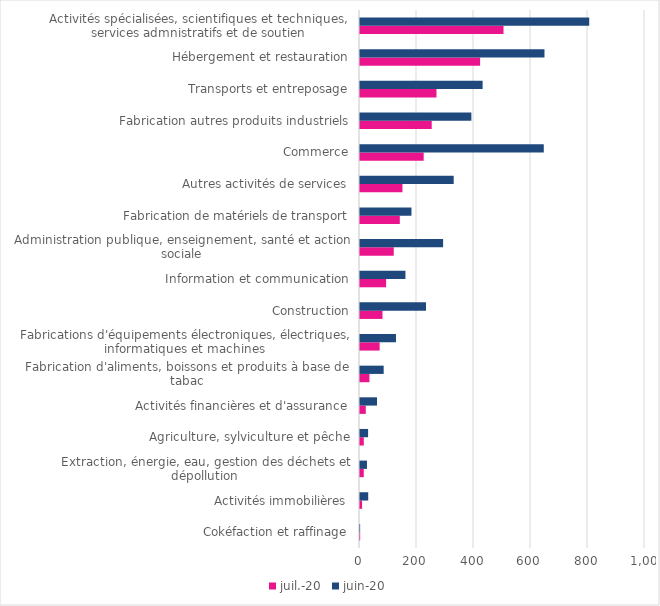
| Category | juil.-20 | juin-20 |
|---|---|---|
| Cokéfaction et raffinage | 0.629 | 0.459 |
| Activités immobilières | 7.309 | 28.805 |
| Extraction, énergie, eau, gestion des déchets et dépollution | 13.247 | 24.463 |
| Agriculture, sylviculture et pêche | 13.296 | 28.381 |
| Activités financières et d'assurance | 20.263 | 59.574 |
| Fabrication d'aliments, boissons et produits à base de tabac | 33.119 | 83.085 |
| Fabrications d'équipements électroniques, électriques, informatiques et machines | 68.926 | 126.231 |
| Construction | 78.912 | 231.576 |
| Information et communication | 91.617 | 159.468 |
| Administration publique, enseignement, santé et action sociale | 118.393 | 291.556 |
| Fabrication de matériels de transport | 139.687 | 180.594 |
| Autres activités de services | 148.938 | 328.773 |
| Commerce | 223.458 | 644.85 |
| Fabrication autres produits industriels | 251.644 | 390.786 |
| Transports et entreposage | 268.34 | 430.244 |
| Hébergement et restauration | 421.447 | 647.266 |
| Activités spécialisées, scientifiques et techniques, services admnistratifs et de soutien | 503.534 | 804.265 |